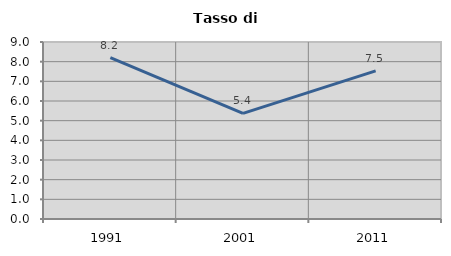
| Category | Tasso di disoccupazione   |
|---|---|
| 1991.0 | 8.204 |
| 2001.0 | 5.371 |
| 2011.0 | 7.533 |